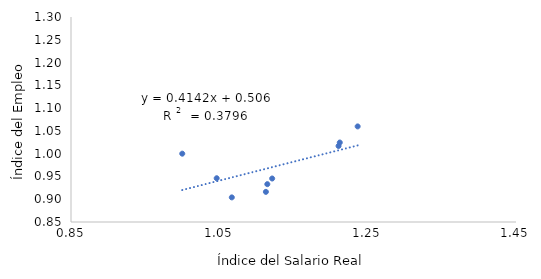
| Category | Series 0 |
|---|---|
| 0 | 1 |
| 1 | 0.946 |
| 2 | 0.904 |
| 3 | 0.945 |
| 4 | 0.916 |
| 5 | 0.933 |
| 6 | 1.024 |
| 7 | 1.017 |
| 8 | 1.06 |